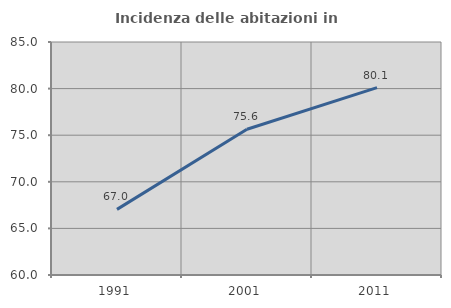
| Category | Incidenza delle abitazioni in proprietà  |
|---|---|
| 1991.0 | 67.043 |
| 2001.0 | 75.64 |
| 2011.0 | 80.103 |